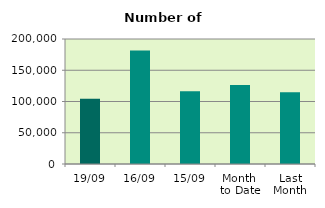
| Category | Series 0 |
|---|---|
| 19/09 | 104566 |
| 16/09 | 181636 |
| 15/09 | 116456 |
| Month 
to Date | 126458.462 |
| Last
Month | 114688 |